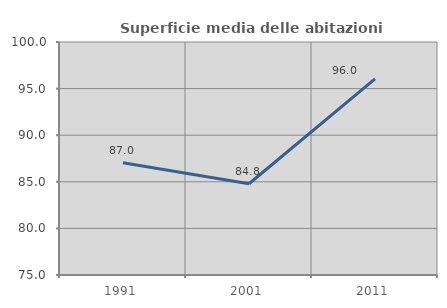
| Category | Superficie media delle abitazioni occupate |
|---|---|
| 1991.0 | 87.044 |
| 2001.0 | 84.792 |
| 2011.0 | 96.037 |